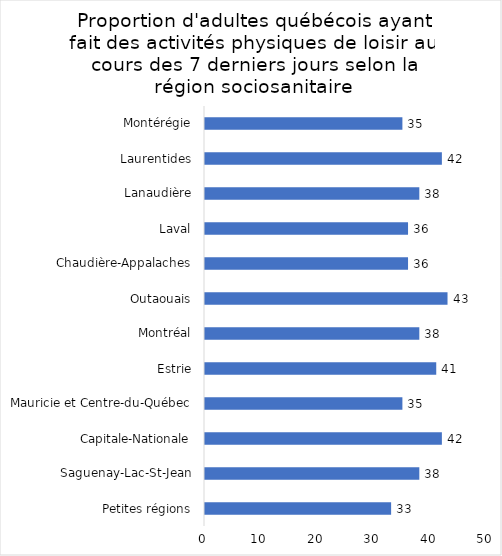
| Category | Series 0 |
|---|---|
| Petites régions | 33 |
| Saguenay-Lac-St-Jean | 38 |
| Capitale-Nationale | 42 |
| Mauricie et Centre-du-Québec | 35 |
| Estrie | 41 |
| Montréal | 38 |
| Outaouais | 43 |
| Chaudière-Appalaches | 36 |
| Laval | 36 |
| Lanaudière | 38 |
| Laurentides | 42 |
| Montérégie | 35 |